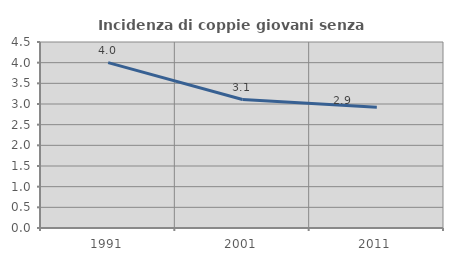
| Category | Incidenza di coppie giovani senza figli |
|---|---|
| 1991.0 | 4 |
| 2001.0 | 3.107 |
| 2011.0 | 2.924 |